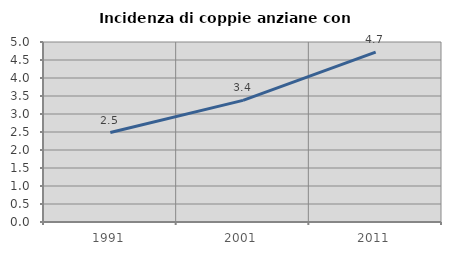
| Category | Incidenza di coppie anziane con figli |
|---|---|
| 1991.0 | 2.485 |
| 2001.0 | 3.378 |
| 2011.0 | 4.719 |